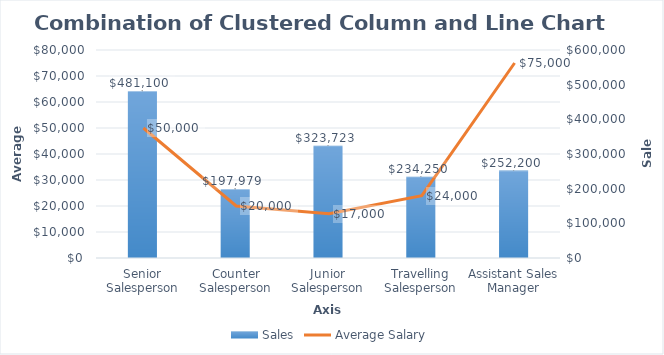
| Category | Sales |
|---|---|
| Senior Salesperson | 481100 |
| Counter Salesperson | 197979 |
| Junior Salesperson | 323723 |
| Travelling Salesperson | 234250 |
| Assistant Sales Manager | 252200 |